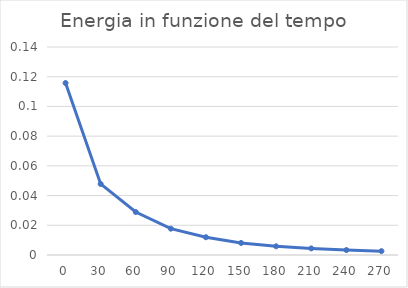
| Category | Series 0 |
|---|---|
| 0.0 | 0.116 |
| 30.0 | 0.048 |
| 60.0 | 0.029 |
| 90.0 | 0.018 |
| 120.0 | 0.012 |
| 150.0 | 0.008 |
| 180.0 | 0.006 |
| 210.0 | 0.004 |
| 240.0 | 0.003 |
| 270.0 | 0.003 |